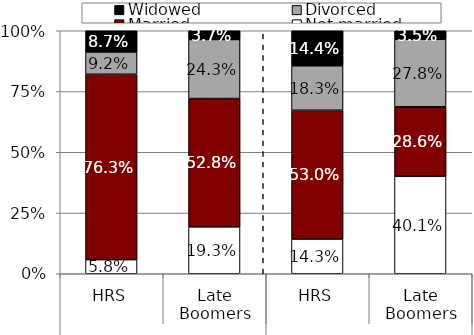
| Category | Not married | Married | Divorced | Widowed |
|---|---|---|---|---|
| 0 | 0.058 | 0.763 | 0.092 | 0.087 |
| 1 | 0.193 | 0.528 | 0.243 | 0.037 |
| 2 | 0.143 | 0.53 | 0.183 | 0.144 |
| 3 | 0.401 | 0.286 | 0.278 | 0.035 |